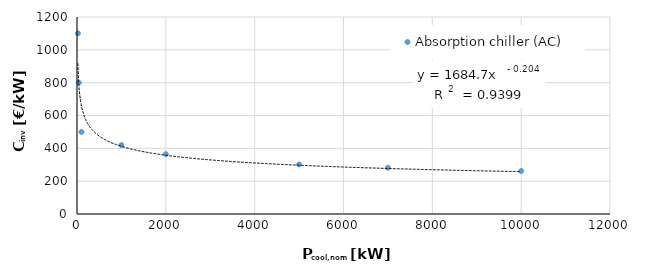
| Category | Absorption chiller (AC) |
|---|---|
| 20.0 | 1100 |
| 40.0 | 800 |
| 100.0 | 500 |
| 1000.0 | 420 |
| 2000.0 | 364.366 |
| 5000.0 | 301.968 |
| 7000.0 | 281.841 |
| 10000.0 | 261.969 |